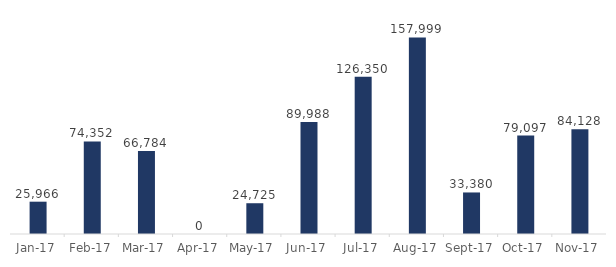
| Category | Series 0 |
|---|---|
| 2017-01-01 | 25966 |
| 2017-02-01 | 74352 |
| 2017-03-01 | 66784 |
| 2017-04-01 | 0 |
| 2017-05-01 | 24725 |
| 2017-06-01 | 89988 |
| 2017-07-01 | 126350 |
| 2017-08-01 | 157999 |
| 2017-09-01 | 33380 |
| 2017-10-01 | 79097 |
| 2017-11-01 | 84128 |